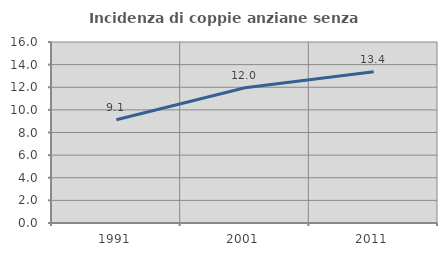
| Category | Incidenza di coppie anziane senza figli  |
|---|---|
| 1991.0 | 9.122 |
| 2001.0 | 11.959 |
| 2011.0 | 13.371 |